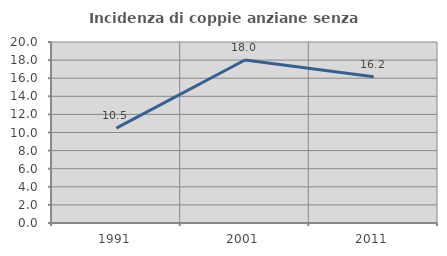
| Category | Incidenza di coppie anziane senza figli  |
|---|---|
| 1991.0 | 10.476 |
| 2001.0 | 18.009 |
| 2011.0 | 16.17 |